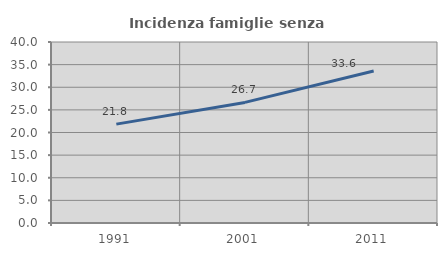
| Category | Incidenza famiglie senza nuclei |
|---|---|
| 1991.0 | 21.849 |
| 2001.0 | 26.651 |
| 2011.0 | 33.596 |